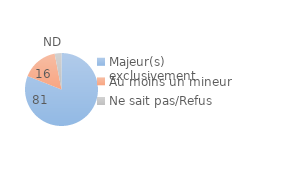
| Category | Series 0 |
|---|---|
| Majeur(s) exclusivement | 81 |
| Au moins un mineur | 16 |
| Ne sait pas/Refus | 3 |